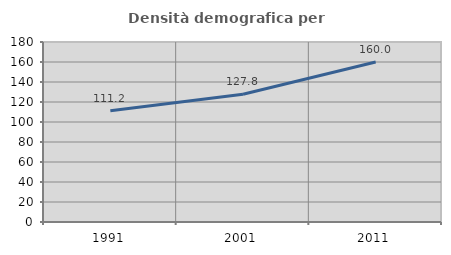
| Category | Densità demografica |
|---|---|
| 1991.0 | 111.221 |
| 2001.0 | 127.761 |
| 2011.0 | 160.027 |